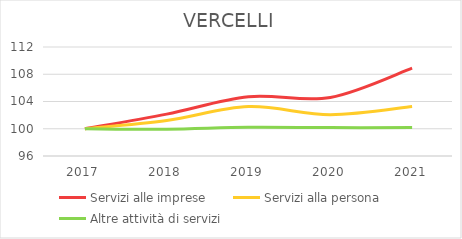
| Category | Servizi alle imprese | Servizi alla persona | Altre attività di servizi |
|---|---|---|---|
| 2017.0 | 100 | 100 | 100 |
| 2018.0 | 102.148 | 101.198 | 99.944 |
| 2019.0 | 104.688 | 103.251 | 100.224 |
| 2020.0 | 104.59 | 102.053 | 100.168 |
| 2021.0 | 108.887 | 103.251 | 100.168 |